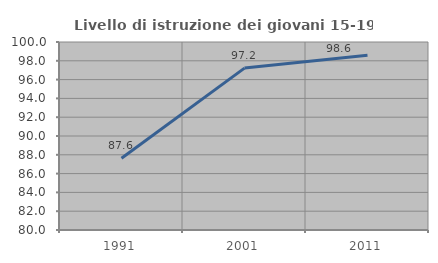
| Category | Livello di istruzione dei giovani 15-19 anni |
|---|---|
| 1991.0 | 87.629 |
| 2001.0 | 97.222 |
| 2011.0 | 98.592 |